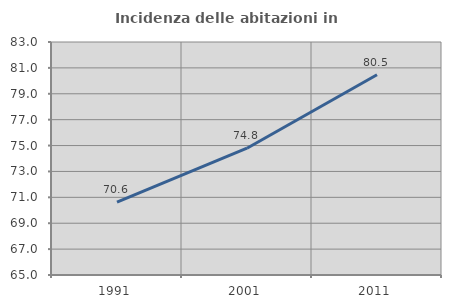
| Category | Incidenza delle abitazioni in proprietà  |
|---|---|
| 1991.0 | 70.633 |
| 2001.0 | 74.796 |
| 2011.0 | 80.466 |